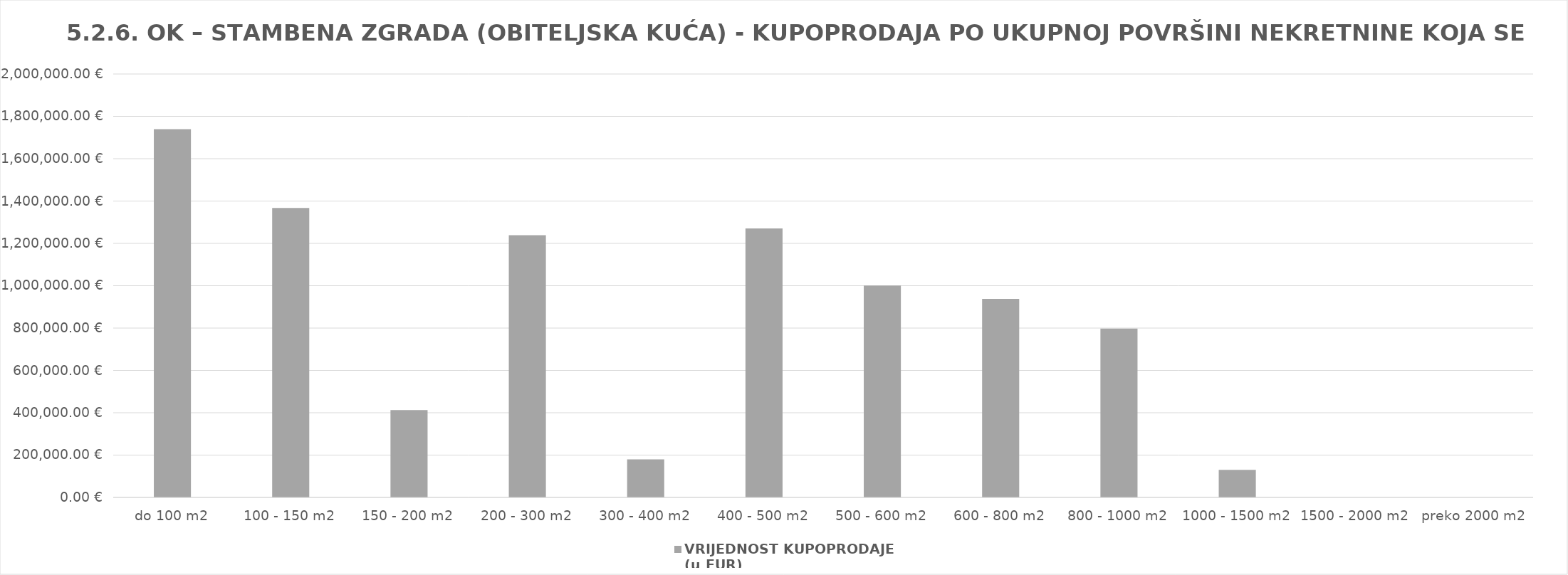
| Category | VRIJEDNOST KUPOPRODAJE   
(u EUR) |
|---|---|
| do 100 m2 | 1739251.724 |
| 100 - 150 m2 | 1367200.869 |
| 150 - 200 m2 | 412486.639 |
| 200 - 300 m2 | 1238427.977 |
| 300 - 400 m2 | 180000 |
| 400 - 500 m2 | 1270606.546 |
| 500 - 600 m2 | 1001173.502 |
| 600 - 800 m2 | 938189.648 |
| 800 - 1000 m2 | 797726.405 |
| 1000 - 1500 m2 | 130646.454 |
| 1500 - 2000 m2 | 0 |
| preko 2000 m2 | 0 |